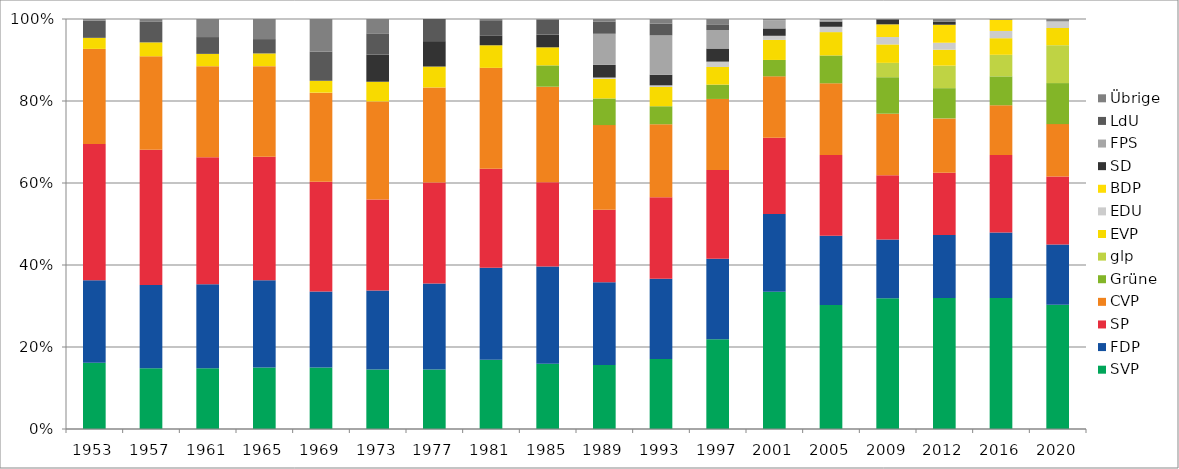
| Category | SVP | FDP | SP | CVP | Grüne | glp | EVP | EDU | BDP | SD | FPS | LdU | Übrige |
|---|---|---|---|---|---|---|---|---|---|---|---|---|---|
| 1953.0 | 16.2 | 20.1 | 33.3 | 23.2 | 0 | 0 | 2.7 | 0 | 0 | 0 | 0 | 4.2 | 0.4 |
| 1957.0 | 14.8 | 20.3 | 33 | 22.8 | 0 | 0 | 3.4 | 0 | 0 | 0 | 0 | 5 | 0.7 |
| 1961.0 | 14.8 | 20.5 | 30.9 | 22.2 | 0 | 0 | 3 | 0 | 0 | 0 | 0 | 4.1 | 4.4 |
| 1965.0 | 15 | 21.3 | 30.1 | 22.1 | 0 | 0 | 3.1 | 0 | 0 | 0 | 0 | 3.5 | 4.9 |
| 1969.0 | 15 | 18.6 | 26.8 | 21.8 | 0 | 0 | 2.9 | 0 | 0 | 0 | 0 | 7.1 | 8 |
| 1973.0 | 14.5 | 19.3 | 22.2 | 23.9 | 0 | 0 | 4.8 | 0 | 0 | 6.6 | 0 | 5.2 | 3.5 |
| 1977.0 | 14.5 | 21 | 24.6 | 23.2 | 0 | 0 | 5.1 | 0 | 0 | 6.2 | 0 | 5.4 | 0 |
| 1981.0 | 16.9 | 22.4 | 24.1 | 24.6 | 0 | 0 | 5.5 | 0 | 0 | 2.3 | 0 | 3.8 | 0.3 |
| 1985.0 | 15.9 | 23.7 | 20.5 | 23.3 | 5.2 | 0 | 4.4 | 0 | 0 | 3.1 | 0 | 3.6 | 0.2 |
| 1989.0 | 15.6 | 20.2 | 17.7 | 20.7 | 6.5 | 0 | 4.8 | 0.3 | 0 | 3.1 | 7.6 | 3 | 0.6 |
| 1993.0 | 17.1 | 19.6 | 19.9 | 17.8 | 4.4 | 0 | 4.7 | 0.4 | 0 | 2.6 | 9.6 | 2.9 | 1.1 |
| 1997.0 | 21.9 | 19.6 | 21.7 | 17.3 | 3.5 | 0 | 4.3 | 1.3 | 0 | 3.2 | 4.5 | 1.4 | 1.3 |
| 2001.0 | 33.5 | 19 | 18.6 | 15 | 4 | 0 | 4.9 | 1 | 0 | 1.8 | 2 | 0 | 0.3 |
| 2005.0 | 30.3 | 16.9 | 19.7 | 17.5 | 6.8 | 0 | 5.7 | 1.3 | 0 | 1.3 | 0.3 | 0 | 0.3 |
| 2009.0 | 31.9 | 14.3 | 15.7 | 15 | 8.9 | 3.5 | 4.5 | 1.8 | 3.1 | 1.2 | 0 | 0 | 0.1 |
| 2012.0 | 32 | 15.4 | 15.2 | 13.3 | 7.4 | 5.5 | 3.9 | 1.7 | 4.4 | 0.7 | 0 | 0 | 0.7 |
| 2016.0 | 31.938 | 15.997 | 18.919 | 12.104 | 7.051 | 5.26 | 4.048 | 1.77 | 2.706 | 0 | 0 | 0 | 0.207 |
| 2020.0 | 30.305 | 14.708 | 16.549 | 12.802 | 10.007 | 9.232 | 4.202 | 1.602 | 0 | 0 | 0 | 0 | 0.593 |